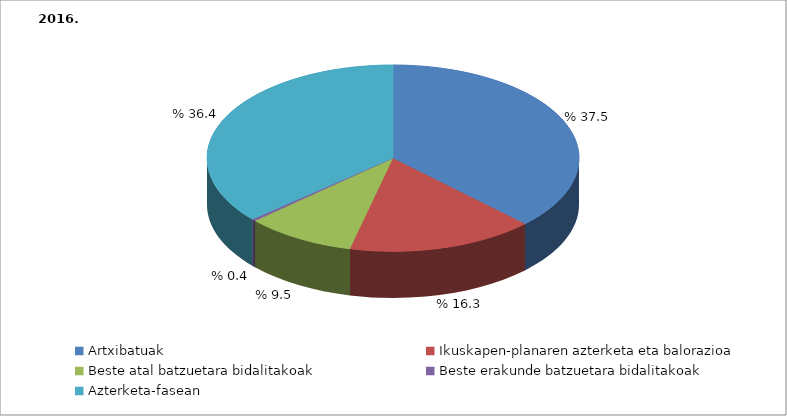
| Category | Series 0 |
|---|---|
| Artxibatuak | 106 |
| Ikuskapen-planaren azterketa eta balorazioa | 46 |
| Beste atal batzuetara bidalitakoak | 27 |
| Beste erakunde batzuetara bidalitakoak | 1 |
| Azterketa-fasean | 103 |